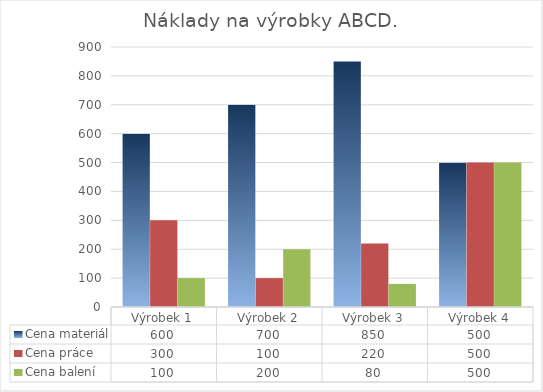
| Category | Cena materiál | Cena práce | Cena balení |
|---|---|---|---|
| Výrobek 1 | 600 | 300 | 100 |
| Výrobek 2 | 700 | 100 | 200 |
| Výrobek 3 | 850 | 220 | 80 |
| Výrobek 4 | 500 | 500 | 500 |